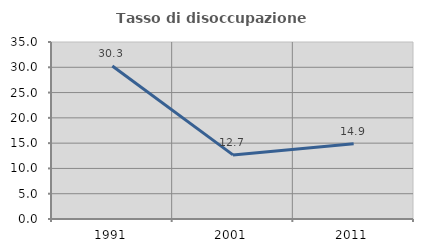
| Category | Tasso di disoccupazione giovanile  |
|---|---|
| 1991.0 | 30.263 |
| 2001.0 | 12.676 |
| 2011.0 | 14.894 |